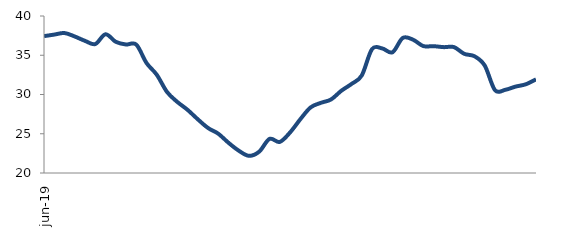
| Category | Series 0 |
|---|---|
| 2019-06-01 | 37.435 |
| 2019-07-01 | 37.632 |
| 2019-08-01 | 37.831 |
| 2019-09-01 | 37.39 |
| 2019-10-01 | 36.831 |
| 2019-11-01 | 36.425 |
| 2019-12-01 | 37.671 |
| 2020-01-01 | 36.714 |
| 2020-02-01 | 36.369 |
| 2020-03-01 | 36.361 |
| 2020-04-01 | 34.017 |
| 2020-05-01 | 32.52 |
| 2020-06-01 | 30.328 |
| 2020-07-01 | 29.058 |
| 2020-08-01 | 28.052 |
| 2020-09-01 | 26.848 |
| 2020-10-01 | 25.737 |
| 2020-11-01 | 25.008 |
| 2020-12-01 | 23.848 |
| 2021-01-01 | 22.846 |
| 2021-02-01 | 22.188 |
| 2021-03-01 | 22.726 |
| 2021-04-01 | 24.345 |
| 2021-05-01 | 23.958 |
| 2021-06-01 | 25.156 |
| 2021-07-01 | 26.838 |
| 2021-08-01 | 28.346 |
| 2021-09-01 | 28.934 |
| 2021-10-01 | 29.363 |
| 2021-11-01 | 30.47 |
| 2021-12-01 | 31.341 |
| 2022-01-01 | 32.424 |
| 2022-02-01 | 35.771 |
| 2022-03-01 | 35.868 |
| 2022-04-01 | 35.381 |
| 2022-05-01 | 37.2 |
| 2022-06-01 | 36.986 |
| 2022-07-01 | 36.172 |
| 2022-08-01 | 36.157 |
| 2022-09-01 | 36.033 |
| 2022-10-01 | 36.034 |
| 2022-11-01 | 35.183 |
| 2022-12-01 | 34.87 |
| 2023-01-01 | 33.684 |
| 2023-02-01 | 30.55 |
| 2023-03-01 | 30.596 |
| 2023-04-01 | 31.004 |
| 2023-05-01 | 31.3 |
| 2023-06-01 | 31.93 |